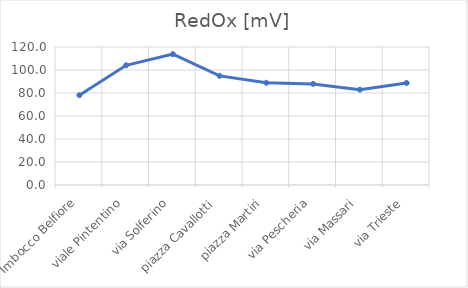
| Category | RedOx [mV] |
|---|---|
| Imbocco Belfiore | 78.1 |
| viale Pintentino | 104.1 |
| via Solferino | 113.8 |
| piazza Cavallotti | 94.9 |
| piazza Martiri | 88.9 |
| via Pescheria | 87.9 |
| via Massari | 82.9 |
| via Trieste | 88.7 |